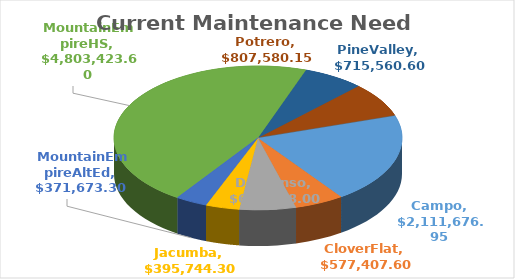
| Category | Series 0 |
|---|---|
| Campo | 2111676.95 |
| CloverFlat | 577407.6 |
| Descanso | 660498 |
| Jacumba | 395744.3 |
| MountainEmpireAltEd | 371673.3 |
| MountainEmpireHS | 4803423.6 |
| PineValley | 715560.6 |
| Potrero | 807580.15 |
| MOT | 0 |